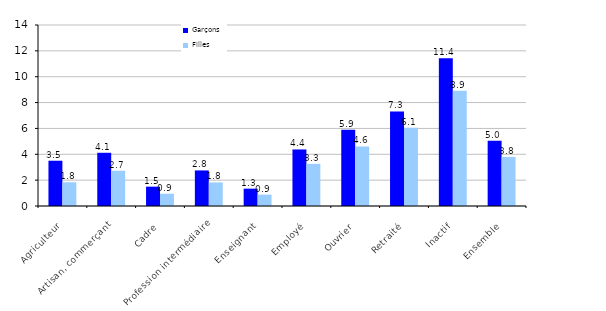
| Category | Garçons | Filles |
|---|---|---|
| Agriculteur | 3.501 | 1.837 |
| Artisan, commerçant | 4.116 | 2.727 |
| Cadre | 1.495 | 0.947 |
| Profession intermédiaire | 2.751 | 1.821 |
| Enseignant | 1.342 | 0.876 |
| Employé | 4.374 | 3.26 |
| Ouvrier | 5.9 | 4.603 |
| Retraité | 7.313 | 6.051 |
| Inactif | 11.429 | 8.921 |
| Ensemble | 5.05 | 3.795 |